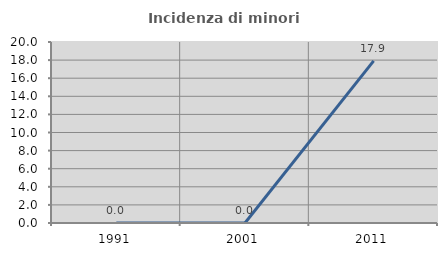
| Category | Incidenza di minori stranieri |
|---|---|
| 1991.0 | 0 |
| 2001.0 | 0 |
| 2011.0 | 17.91 |